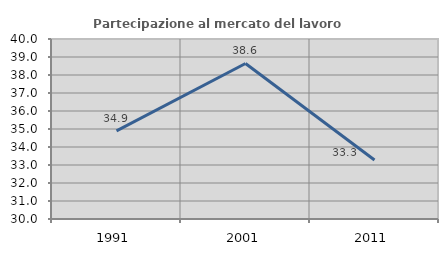
| Category | Partecipazione al mercato del lavoro  femminile |
|---|---|
| 1991.0 | 34.894 |
| 2001.0 | 38.64 |
| 2011.0 | 33.282 |